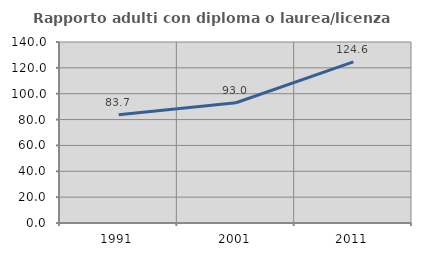
| Category | Rapporto adulti con diploma o laurea/licenza media  |
|---|---|
| 1991.0 | 83.673 |
| 2001.0 | 92.994 |
| 2011.0 | 124.571 |